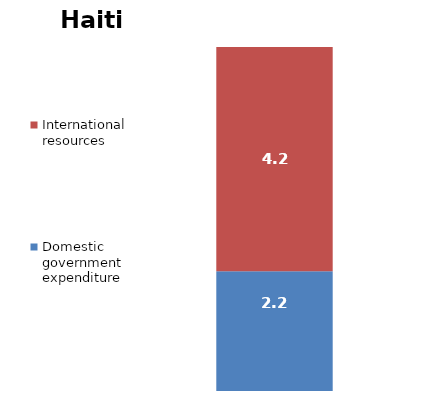
| Category | Domestic government expenditure | International resources |
|---|---|---|
| 0 | 2.224 | 4.163 |